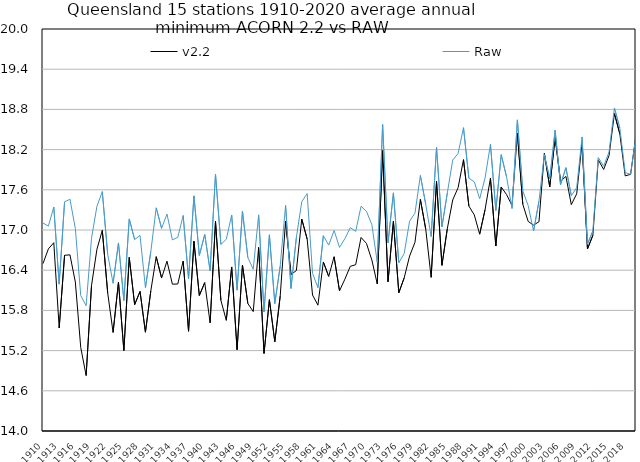
| Category | v2.2 | Raw |
|---|---|---|
| 1910 | 16.499 | 17.104 |
| 1911 | 16.718 | 17.058 |
| 1912 | 16.81 | 17.344 |
| 1913 | 15.537 | 16.192 |
| 1914 | 16.623 | 17.419 |
| 1915 | 16.629 | 17.459 |
| 1916 | 16.223 | 17.022 |
| 1917 | 15.246 | 16.022 |
| 1918 | 14.828 | 15.869 |
| 1919 | 16.172 | 16.878 |
| 1920 | 16.712 | 17.353 |
| 1921 | 16.995 | 17.573 |
| 1922 | 16.061 | 16.636 |
| 1923 | 15.471 | 16.205 |
| 1924 | 16.223 | 16.807 |
| 1925 | 15.201 | 15.948 |
| 1926 | 16.591 | 17.165 |
| 1927 | 15.886 | 16.858 |
| 1928 | 16.083 | 16.919 |
| 1929 | 15.475 | 16.139 |
| 1930 | 16.092 | 16.679 |
| 1931 | 16.602 | 17.331 |
| 1932 | 16.283 | 17.024 |
| 1933 | 16.535 | 17.239 |
| 1934 | 16.191 | 16.852 |
| 1935 | 16.194 | 16.891 |
| 1936 | 16.536 | 17.216 |
| 1937 | 15.489 | 16.272 |
| 1938 | 16.831 | 17.509 |
| 1939 | 16.022 | 16.62 |
| 1940 | 16.215 | 16.933 |
| 1941 | 15.615 | 16.392 |
| 1942 | 17.127 | 17.835 |
| 1943 | 15.95 | 16.785 |
| 1944 | 15.652 | 16.862 |
| 1945 | 16.448 | 17.224 |
| 1946 | 15.214 | 16.103 |
| 1947 | 16.477 | 17.282 |
| 1948 | 15.903 | 16.587 |
| 1949 | 15.782 | 16.415 |
| 1950 | 16.74 | 17.226 |
| 1951 | 15.157 | 15.778 |
| 1952 | 15.96 | 16.929 |
| 1953 | 15.332 | 15.902 |
| 1954 | 16.013 | 16.461 |
| 1955 | 17.134 | 17.367 |
| 1956 | 16.336 | 16.128 |
| 1957 | 16.394 | 16.889 |
| 1958 | 17.163 | 17.422 |
| 1959 | 16.866 | 17.544 |
| 1960 | 16.03 | 16.353 |
| 1961 | 15.878 | 16.14 |
| 1962 | 16.523 | 16.915 |
| 1963 | 16.307 | 16.774 |
| 1964 | 16.601 | 16.993 |
| 1965 | 16.092 | 16.74 |
| 1966 | 16.266 | 16.871 |
| 1967 | 16.458 | 17.036 |
| 1968 | 16.482 | 16.978 |
| 1969 | 16.889 | 17.355 |
| 1970 | 16.799 | 17.278 |
| 1971 | 16.552 | 17.08 |
| 1972 | 16.195 | 16.521 |
| 1973 | 18.187 | 18.573 |
| 1974 | 16.228 | 16.808 |
| 1975 | 17.131 | 17.555 |
| 1976 | 16.063 | 16.51 |
| 1977 | 16.286 | 16.65 |
| 1978 | 16.611 | 17.131 |
| 1979 | 16.816 | 17.252 |
| 1980 | 17.457 | 17.814 |
| 1981 | 17.011 | 17.382 |
| 1982 | 16.293 | 16.902 |
| 1983 | 17.723 | 18.237 |
| 1984 | 16.473 | 17.045 |
| 1985 | 17.02 | 17.553 |
| 1986 | 17.448 | 18.044 |
| 1987 | 17.632 | 18.142 |
| 1988 | 18.049 | 18.527 |
| 1989 | 17.357 | 17.773 |
| 1990 | 17.226 | 17.72 |
| 1991 | 16.938 | 17.466 |
| 1992 | 17.303 | 17.776 |
| 1993 | 17.774 | 18.278 |
| 1994 | 16.761 | 17.292 |
| 1995 | 17.642 | 18.124 |
| 1996 | 17.527 | 17.789 |
| 1997 | 17.366 | 17.321 |
| 1998 | 18.447 | 18.644 |
| 1999 | 17.384 | 17.583 |
| 2000 | 17.128 | 17.364 |
| 2001 | 17.073 | 16.985 |
| 2002 | 17.123 | 17.43 |
| 2003 | 18.143 | 18.125 |
| 2004 | 17.644 | 17.764 |
| 2005 | 18.382 | 18.49 |
| 2006 | 17.726 | 17.675 |
| 2007 | 17.8 | 17.93 |
| 2008 | 17.379 | 17.513 |
| 2009 | 17.54 | 17.632 |
| 2010 | 18.302 | 18.389 |
| 2011 | 16.717 | 16.788 |
| 2012 | 16.921 | 16.987 |
| 2013 | 18.048 | 18.082 |
| 2014 | 17.904 | 17.952 |
| 2015 | 18.112 | 18.165 |
| 2016 | 18.739 | 18.822 |
| 2017 | 18.435 | 18.521 |
| 2018 | 17.808 | 17.856 |
| 2019 | 17.831 | 17.831 |
| 2020 | 18.413 | 18.407 |